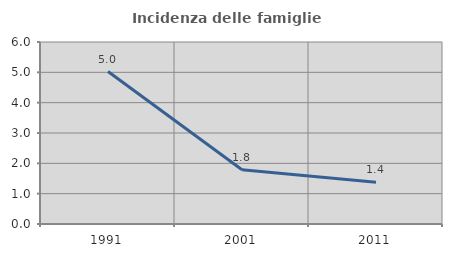
| Category | Incidenza delle famiglie numerose |
|---|---|
| 1991.0 | 5.026 |
| 2001.0 | 1.787 |
| 2011.0 | 1.378 |